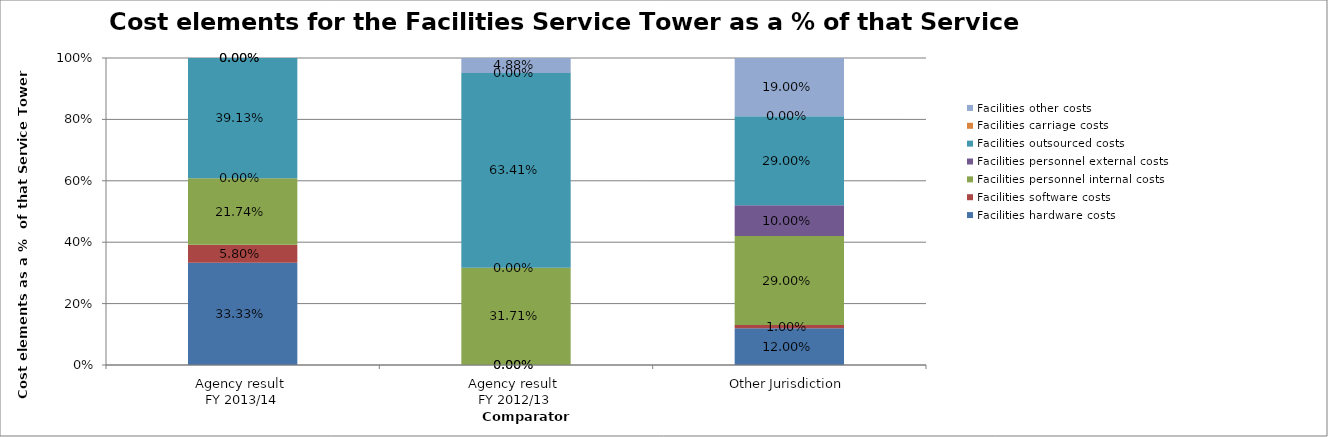
| Category | Facilities hardware costs | Facilities software costs | Facilities personnel internal costs | Facilities personnel external costs | Facilities outsourced costs | Facilities carriage costs | Facilities other costs |
|---|---|---|---|---|---|---|---|
| Agency result 
FY 2013/14 | 0.333 | 0.058 | 0.217 | 0 | 0.391 | 0 | 0 |
| Agency result 
FY 2012/13 | 0 | 0 | 0.317 | 0 | 0.634 | 0 | 0.049 |
| Other Jurisdiction | 0.12 | 0.01 | 0.29 | 0.1 | 0.29 | 0 | 0.19 |